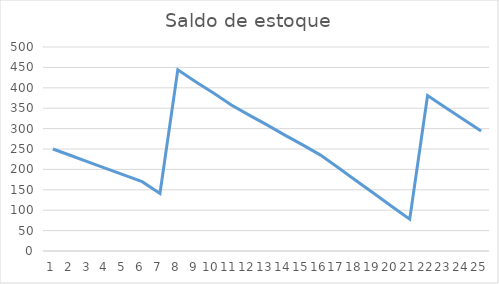
| Category | Saldo inicial |
|---|---|
| 0 | 250 |
| 1 | 234 |
| 2 | 218 |
| 3 | 202 |
| 4 | 186 |
| 5 | 170 |
| 6 | 141 |
| 7 | 444 |
| 8 | 415 |
| 9 | 387 |
| 10 | 358 |
| 11 | 333 |
| 12 | 309 |
| 13 | 284 |
| 14 | 260 |
| 15 | 235 |
| 16 | 204 |
| 17 | 172 |
| 18 | 141 |
| 19 | 109 |
| 20 | 78 |
| 21 | 381 |
| 22 | 352 |
| 23 | 323 |
| 24 | 294 |